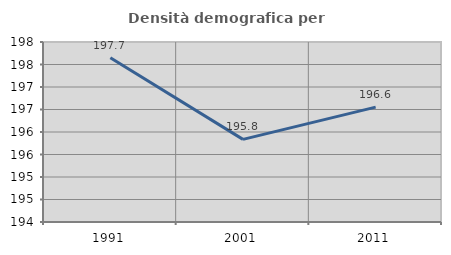
| Category | Densità demografica |
|---|---|
| 1991.0 | 197.651 |
| 2001.0 | 195.836 |
| 2011.0 | 196.553 |